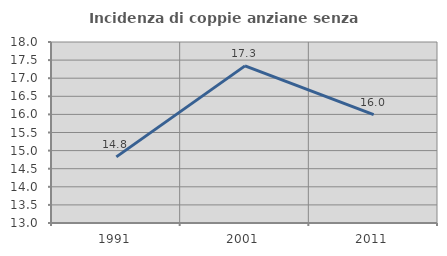
| Category | Incidenza di coppie anziane senza figli  |
|---|---|
| 1991.0 | 14.826 |
| 2001.0 | 17.34 |
| 2011.0 | 15.992 |